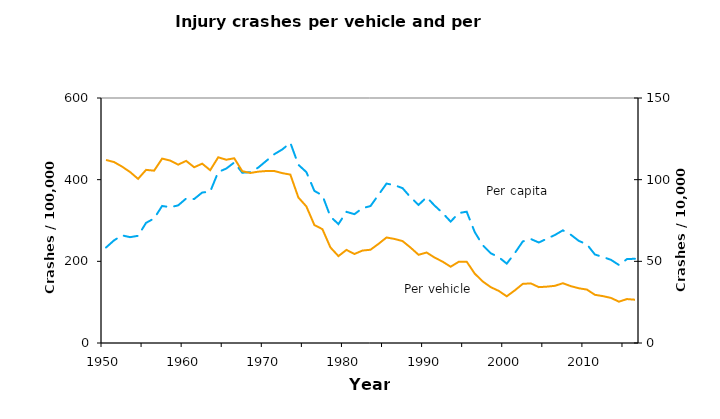
| Category | Series 0 |
|---|---|
| 1950.0 | 233.794 |
| 1951.0 | 251.3 |
| 1952.0 | 263.6 |
| 1953.0 | 259.2 |
| 1954.0 | 262.5 |
| 1955.0 | 294.3 |
| 1956.0 | 304.9 |
| 1957.0 | 335.6 |
| 1958.0 | 332.5 |
| 1959.0 | 337 |
| 1960.0 | 353.8 |
| 1961.0 | 352.6 |
| 1962.0 | 368.5 |
| 1963.0 | 370.7 |
| 1964.0 | 418.8 |
| 1965.0 | 427.1 |
| 1966.0 | 442.1 |
| 1967.0 | 417 |
| 1968.0 | 418.3 |
| 1969.0 | 429.7 |
| 1970.0 | 446.1 |
| 1971.0 | 462.4 |
| 1972.0 | 474.1 |
| 1973.0 | 490.3 |
| 1974.0 | 436.5 |
| 1975.0 | 418.5 |
| 1976.0 | 372.5 |
| 1977.0 | 361.4 |
| 1978.0 | 309.5 |
| 1979.0 | 291.2 |
| 1980.0 | 321.2 |
| 1981.0 | 315.5 |
| 1982.0 | 330.2 |
| 1983.0 | 335.4 |
| 1984.0 | 362.9 |
| 1985.0 | 390.4 |
| 1986.0 | 386.5 |
| 1987.0 | 379.2 |
| 1988.0 | 356.8 |
| 1989.0 | 338.1 |
| 1990.0 | 357.1 |
| 1991.0 | 336.5 |
| 1992.0 | 318.3 |
| 1993.0 | 297.2 |
| 1994.0 | 318.1 |
| 1995.0 | 321.6 |
| 1996.0 | 271.9 |
| 1997.0 | 239.6 |
| 1998.0 | 219.8 |
| 1999.0 | 210.2 |
| 2000.0 | 194.4 |
| 2001.0 | 220 |
| 2002.0 | 248.7 |
| 2003.0 | 254.7 |
| 2004.0 | 246.1 |
| 2005.0 | 255.4 |
| 2006.0 | 264.4 |
| 2007.0 | 275.9 |
| 2008.0 | 265.1 |
| 2009.0 | 250 |
| 2010.0 | 241.5 |
| 2011.0 | 216.7 |
| 2012.0 | 210.6 |
| 2013.0 | 203.7 |
| 2014.0 | 191 |
| 2015.0 | 205.5 |
| 2016.0 | 206.3 |